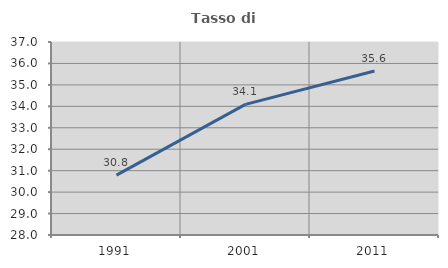
| Category | Tasso di occupazione   |
|---|---|
| 1991.0 | 30.791 |
| 2001.0 | 34.091 |
| 2011.0 | 35.649 |